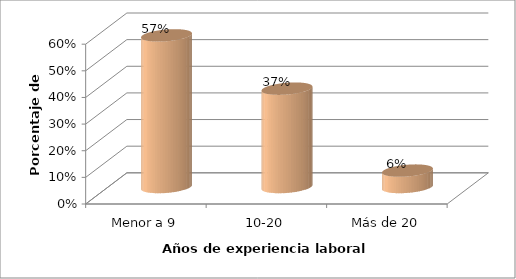
| Category | Series 0 |
|---|---|
| Menor a 9 | 0.569 |
| 10-20 | 0.369 |
| Más de 20 | 0.062 |